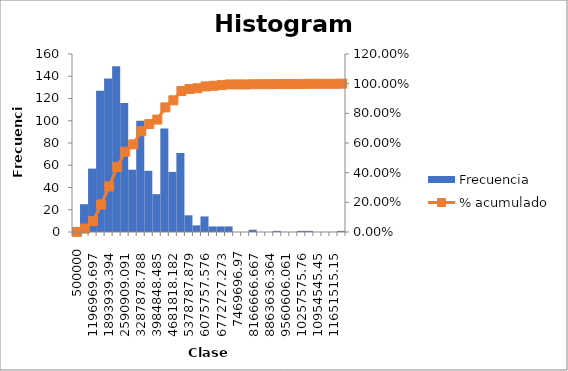
| Category | Frecuencia |
|---|---|
| 500000 | 1 |
| 848484,8485 | 25 |
| 1196969,697 | 57 |
| 1545454,545 | 127 |
| 1893939,394 | 138 |
| 2242424,242 | 149 |
| 2590909,091 | 116 |
| 2939393,939 | 56 |
| 3287878,788 | 100 |
| 3636363,636 | 55 |
| 3984848,485 | 34 |
| 4333333,333 | 93 |
| 4681818,182 | 54 |
| 5030303,03 | 71 |
| 5378787,879 | 15 |
| 5727272,727 | 6 |
| 6075757,576 | 14 |
| 6424242,424 | 5 |
| 6772727,273 | 5 |
| 7121212,121 | 5 |
| 7469696,97 | 0 |
| 7818181,818 | 0 |
| 8166666,667 | 2 |
| 8515151,515 | 0 |
| 8863636,364 | 0 |
| 9212121,212 | 1 |
| 9560606,061 | 0 |
| 9909090,909 | 0 |
| 10257575,76 | 1 |
| 10606060,61 | 1 |
| 10954545,45 | 0 |
| 11303030,3 | 0 |
| 11651515,15 | 0 |
| y mayor... | 1 |